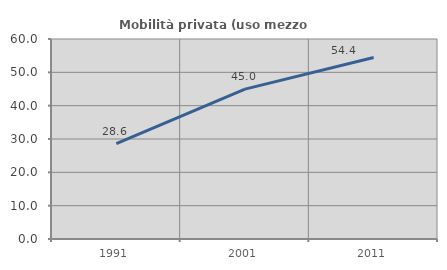
| Category | Mobilità privata (uso mezzo privato) |
|---|---|
| 1991.0 | 28.613 |
| 2001.0 | 44.974 |
| 2011.0 | 54.43 |